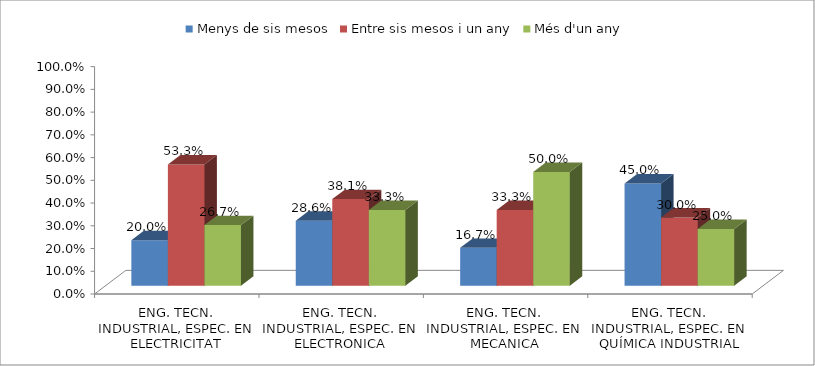
| Category | Menys de sis mesos | Entre sis mesos i un any | Més d'un any |
|---|---|---|---|
| ENG. TECN. INDUSTRIAL, ESPEC. EN ELECTRICITAT | 0.2 | 0.533 | 0.267 |
| ENG. TECN. INDUSTRIAL, ESPEC. EN ELECTRONICA INDUSTRIAL | 0.286 | 0.381 | 0.333 |
| ENG. TECN. INDUSTRIAL, ESPEC. EN MECANICA | 0.167 | 0.333 | 0.5 |
| ENG. TECN. INDUSTRIAL, ESPEC. EN QUÍMICA INDUSTRIAL | 0.45 | 0.3 | 0.25 |